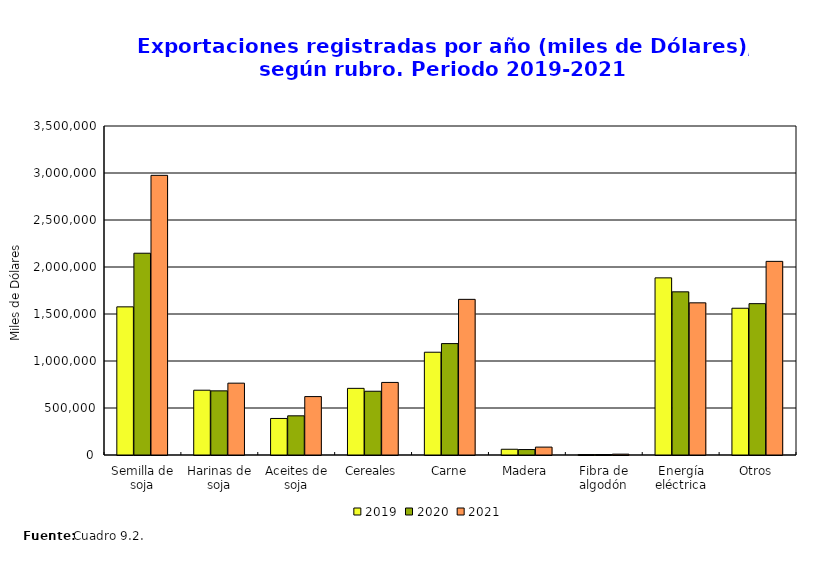
| Category | 2019 | 2020 | 2021 |
|---|---|---|---|
| Semilla de soja | 1576120.071 | 2146549.946 | 2975124.106 |
| Harinas de soja | 689277.788 | 682342.431 | 764201.387 |
| Aceites de soja | 388711.294 | 416786.645 | 621353.656 |
| Cereales | 709047.254 | 678291.568 | 772103.943 |
| Carne | 1093260.955 | 1185104.13 | 1655761.084 |
| Madera | 61109.737 | 57867.354 | 84056.064 |
| Fibra de algodón | 4510.634 | 5130.493 | 9068.847 |
| Energía eléctrica | 1884466.47 | 1735721.112 | 1618736.166 |
| Otros | 1561301.119 | 1610137.904 | 2059946.558 |